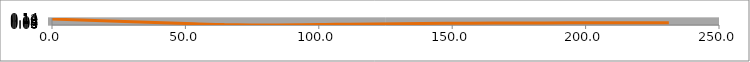
| Category | Series 0 |
|---|---|
| 0.0 | 0.119 |
| 53.2045 | 0.024 |
| 64.5758 | 0.008 |
| 74.7571 | 0 |
| 84.2417 | 0 |
| 93.3746 | 0.004 |
| 102.37 | 0.01 |
| 111.345 | 0.016 |
| 120.354 | 0.022 |
| 129.415 | 0.027 |
| 138.53 | 0.031 |
| 147.691 | 0.034 |
| 156.888 | 0.036 |
| 166.114 | 0.038 |
| 175.362 | 0.04 |
| 184.629 | 0.042 |
| 193.911 | 0.043 |
| 203.209 | 0.044 |
| 212.522 | 0.045 |
| 221.851 | 0.046 |
| 231.197 | 0.047 |